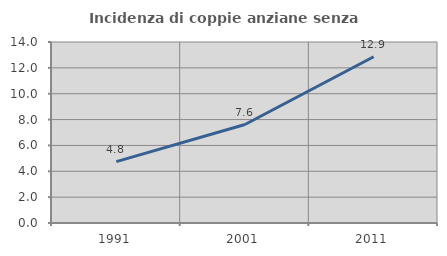
| Category | Incidenza di coppie anziane senza figli  |
|---|---|
| 1991.0 | 4.751 |
| 2001.0 | 7.618 |
| 2011.0 | 12.857 |